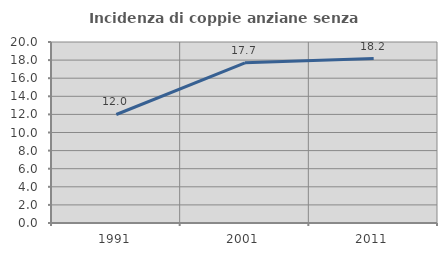
| Category | Incidenza di coppie anziane senza figli  |
|---|---|
| 1991.0 | 11.99 |
| 2001.0 | 17.699 |
| 2011.0 | 18.168 |